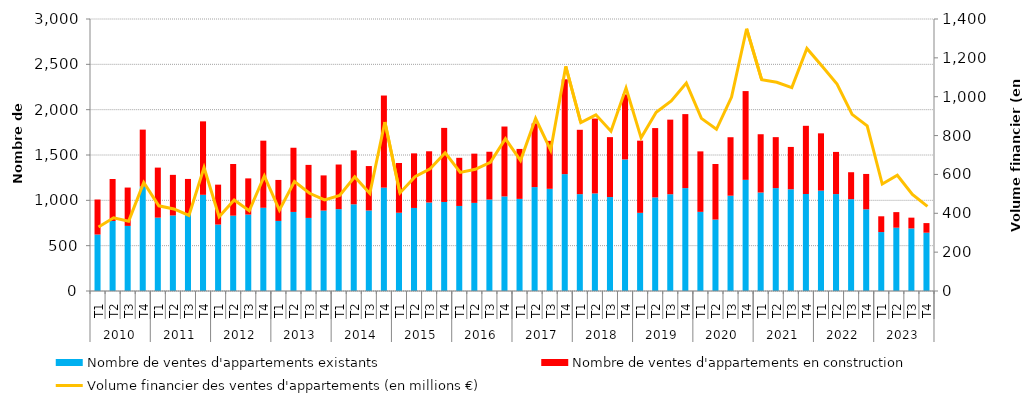
| Category | Nombre de ventes d'appartements existants | Nombre de ventes d'appartements en construction |
|---|---|---|
| 0 | 623 | 386 |
| 1 | 772 | 463 |
| 2 | 718 | 423 |
| 3 | 1153 | 627 |
| 4 | 809 | 552 |
| 5 | 833 | 448 |
| 6 | 852 | 384 |
| 7 | 1061 | 810 |
| 8 | 733 | 440 |
| 9 | 831 | 570 |
| 10 | 843 | 399 |
| 11 | 918 | 740 |
| 12 | 773 | 452 |
| 13 | 872 | 708 |
| 14 | 806 | 585 |
| 15 | 887 | 388 |
| 16 | 903 | 492 |
| 17 | 956 | 595 |
| 18 | 888 | 490 |
| 19 | 1140 | 1016 |
| 20 | 863 | 549 |
| 21 | 916 | 602 |
| 22 | 976 | 565 |
| 23 | 982 | 817 |
| 24 | 938 | 531 |
| 25 | 972 | 543 |
| 26 | 1009 | 527 |
| 27 | 1043 | 771 |
| 28 | 1016 | 551 |
| 29 | 1146 | 702 |
| 30 | 1127 | 529 |
| 31 | 1289 | 1046 |
| 32 | 1068 | 710 |
| 33 | 1076 | 826 |
| 34 | 1036 | 661 |
| 35 | 1451 | 717 |
| 36 | 862 | 796 |
| 37 | 1032 | 765 |
| 38 | 1067 | 823 |
| 39 | 1135 | 816 |
| 40 | 873 | 667 |
| 41 | 788 | 613 |
| 42 | 1051 | 645 |
| 43 | 1226 | 979 |
| 44 | 1086 | 643 |
| 45 | 1135 | 562 |
| 46 | 1122 | 467 |
| 47 | 1070 | 752 |
| 48 | 1107 | 632 |
| 49 | 1069 | 465 |
| 50 | 1013 | 297 |
| 51 | 901 | 390 |
| 52 | 650 | 174 |
| 53 | 698 | 172 |
| 54 | 690 | 119 |
| 55 | 643 | 106 |